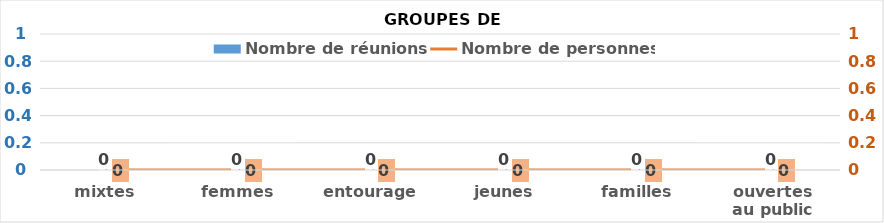
| Category | Nombre de réunions |
|---|---|
| mixtes | 0 |
| femmes | 0 |
| entourage | 0 |
| jeunes | 0 |
| familles | 0 |
| ouvertes au public | 0 |